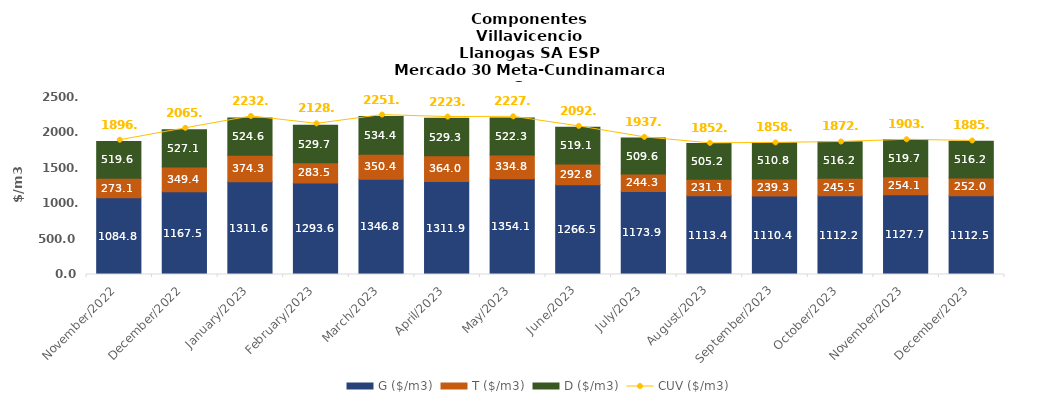
| Category | G ($/m3) | T ($/m3) | D ($/m3) |
|---|---|---|---|
| 2022-11-01 | 1084.79 | 273.13 | 519.57 |
| 2022-12-01 | 1167.54 | 349.4 | 527.09 |
| 2023-01-01 | 1311.57 | 374.33 | 524.58 |
| 2023-02-01 | 1293.59 | 283.45 | 529.74 |
| 2023-03-01 | 1346.83 | 350.38 | 534.44 |
| 2023-04-01 | 1311.89 | 364.02 | 529.26 |
| 2023-05-01 | 1354.14 | 334.83 | 522.32 |
| 2023-06-01 | 1266.52 | 292.77 | 519.06 |
| 2023-07-01 | 1173.91 | 244.29 | 509.62 |
| 2023-08-01 | 1113.38 | 231.11 | 505.17 |
| 2023-09-01 | 1110.42 | 239.27 | 510.83 |
| 2023-10-01 | 1112.24 | 245.53 | 516.22 |
| 2023-11-01 | 1127.7 | 254.12 | 519.71 |
| 2023-12-01 | 1112.49 | 252.02 | 516.22 |